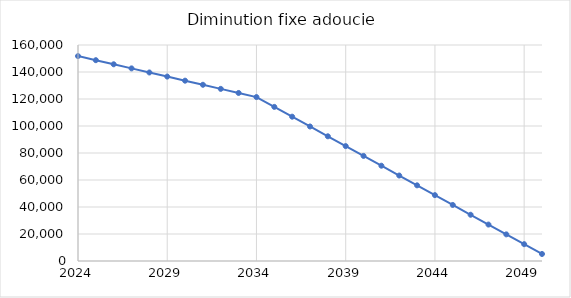
| Category | Diminution fixe adoucie |
|---|---|
| 2024.0 | 151788 |
| 2025.0 | 148752.24 |
| 2026.0 | 145716.48 |
| 2027.0 | 142680.72 |
| 2028.0 | 139644.96 |
| 2029.0 | 136609.2 |
| 2030.0 | 133573.44 |
| 2031.0 | 130537.68 |
| 2032.0 | 127501.92 |
| 2033.0 | 124466.16 |
| 2034.0 | 121430.4 |
| 2035.0 | 114166 |
| 2036.0 | 106901.6 |
| 2037.0 | 99637.2 |
| 2038.0 | 92372.8 |
| 2039.0 | 85108.4 |
| 2040.0 | 77844 |
| 2041.0 | 70579.6 |
| 2042.0 | 63315.2 |
| 2043.0 | 56050.8 |
| 2044.0 | 48786.4 |
| 2045.0 | 41522 |
| 2046.0 | 34257.6 |
| 2047.0 | 26993.2 |
| 2048.0 | 19728.8 |
| 2049.0 | 12464.4 |
| 2050.0 | 5200 |